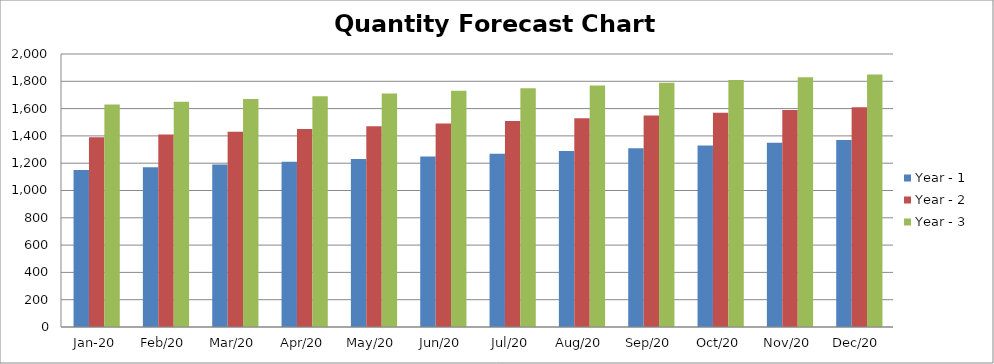
| Category | Year - 1 | Year - 2 | Year - 3 |
|---|---|---|---|
| 2020-01-01 | 1150 | 1390 | 1630 |
| 2020-02-01 | 1170 | 1410 | 1650 |
| 2020-03-01 | 1190 | 1430 | 1670 |
| 2020-04-01 | 1210 | 1450 | 1690 |
| 2020-05-01 | 1230 | 1470 | 1710 |
| 2020-06-01 | 1250 | 1490 | 1730 |
| 2020-07-01 | 1270 | 1510 | 1750 |
| 2020-08-01 | 1290 | 1530 | 1770 |
| 2020-09-01 | 1310 | 1550 | 1790 |
| 2020-10-01 | 1330 | 1570 | 1810 |
| 2020-11-01 | 1350 | 1590 | 1830 |
| 2020-12-01 | 1370 | 1610 | 1850 |